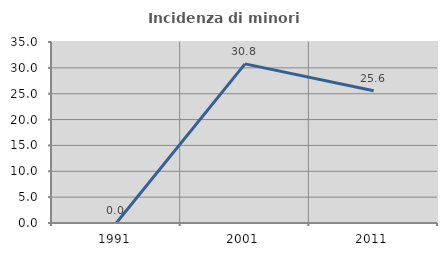
| Category | Incidenza di minori stranieri |
|---|---|
| 1991.0 | 0 |
| 2001.0 | 30.769 |
| 2011.0 | 25.581 |